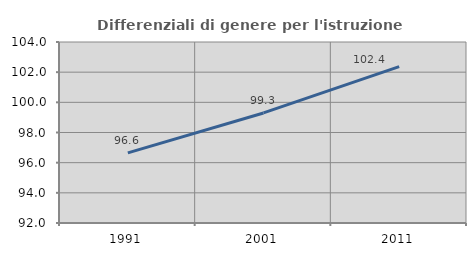
| Category | Differenziali di genere per l'istruzione superiore |
|---|---|
| 1991.0 | 96.648 |
| 2001.0 | 99.297 |
| 2011.0 | 102.368 |